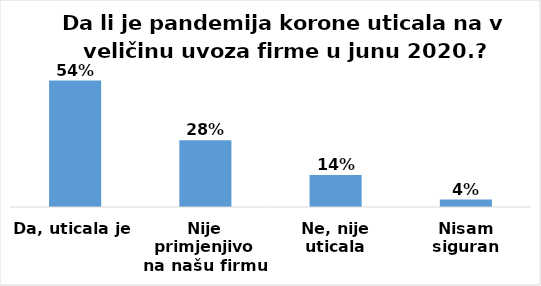
| Category | Series 0 |
|---|---|
| Da, uticala je | 186 |
| Nije primjenjivo na našu firmu | 98 |
| Ne, nije uticala | 47 |
| Nisam siguran | 11 |